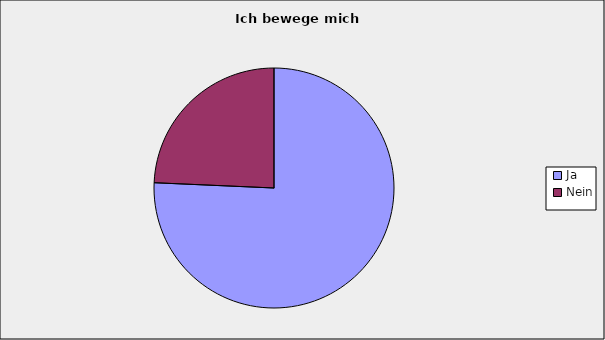
| Category | Series 0 |
|---|---|
| Ja | 0.757 |
| Nein | 0.243 |